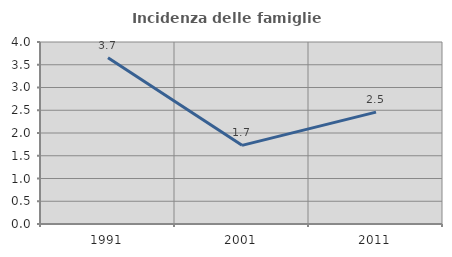
| Category | Incidenza delle famiglie numerose |
|---|---|
| 1991.0 | 3.654 |
| 2001.0 | 1.729 |
| 2011.0 | 2.459 |